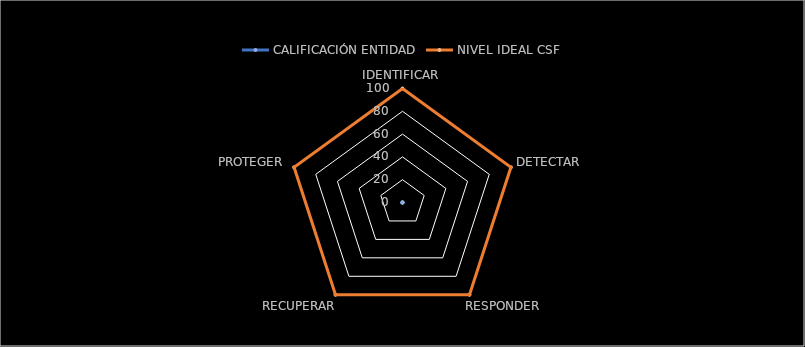
| Category | CALIFICACIÓN ENTIDAD | NIVEL IDEAL CSF |
|---|---|---|
| IDENTIFICAR | 0 | 100 |
| DETECTAR | 0 | 100 |
| RESPONDER | 0 | 100 |
| RECUPERAR | 0 | 100 |
| PROTEGER | 0 | 100 |